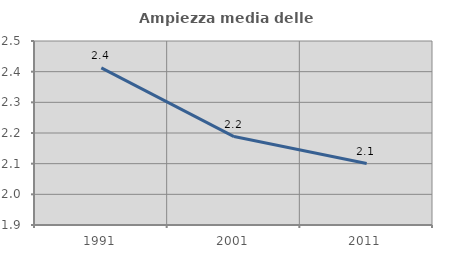
| Category | Ampiezza media delle famiglie |
|---|---|
| 1991.0 | 2.412 |
| 2001.0 | 2.188 |
| 2011.0 | 2.1 |